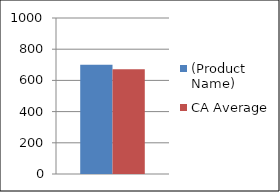
| Category | (Product Name) | CA Average |
|---|---|---|
| 0 | 701 | 672 |